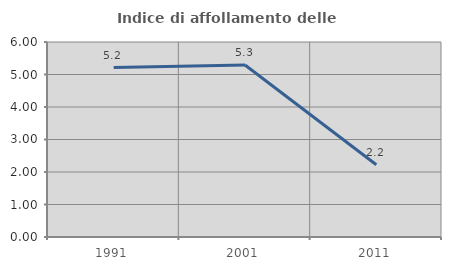
| Category | Indice di affollamento delle abitazioni  |
|---|---|
| 1991.0 | 5.212 |
| 2001.0 | 5.294 |
| 2011.0 | 2.224 |